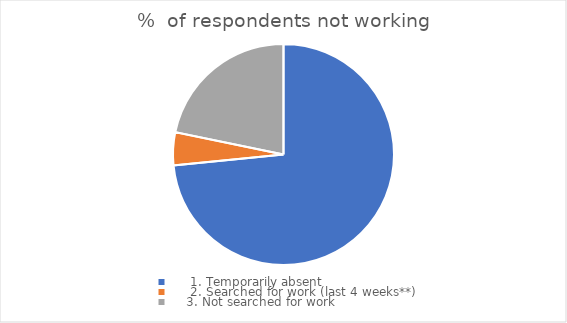
| Category | %  of respondents not working |
|---|---|
|      1. Temporarily absent | 73.424 |
|      2. Searched for work (last 4 weeks**) | 4.818 |
|     3. Not searched for work | 21.758 |